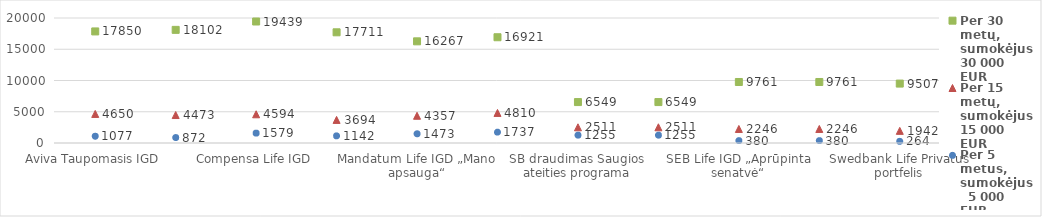
| Category | Per 30 metų, sumokėjus 30 000 EUR | Per 15 metų, sumokėjus 15 000 EUR | Per 5 metus, sumokėjus    5 000 EUR |
|---|---|---|---|
| Aviva Taupomasis IGD | 17850.15 | 4650.25 | 1077.24 |
| Aviva VIP pensinis GD | 18101.75 | 4472.75 | 872.43 |
| Compensa Life IGD | 19439.107 | 4593.761 | 1579.442 |
| ERGO Life Universalus GD | 17710.65 | 3693.57 | 1141.81 |
| Mandatum Life IGD „Mano apsauga“ | 16266.65 | 4356.51 | 1473.18 |
| PZU gyvybė IGD be DR | 16921.303 | 4810.443 | 1737.075 |
| SB draudimas Saugios ateities programa | 6549.14 | 2511.225 | 1254.966 |
| SB draudimas Pensijų programa | 6549.14 | 2511.225 | 1254.966 |
| SEB Life IGD „Aprūpinta senatvė“ | 9761.476 | 2246.432 | 380.073 |
| SEB Life IGD „SEB verslui“ | 9761.476 | 2246.432 | 380.073 |
| Swedbank Life Privatus portfelis | 9506.89 | 1941.62 | 264.44 |